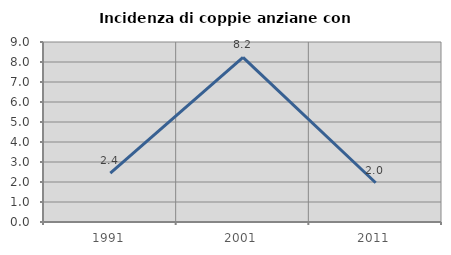
| Category | Incidenza di coppie anziane con figli |
|---|---|
| 1991.0 | 2.439 |
| 2001.0 | 8.23 |
| 2011.0 | 1.961 |